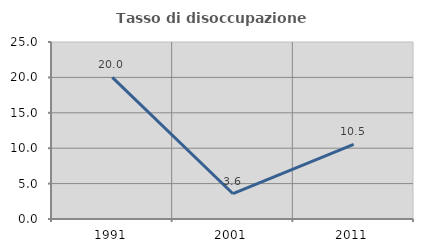
| Category | Tasso di disoccupazione giovanile  |
|---|---|
| 1991.0 | 20 |
| 2001.0 | 3.571 |
| 2011.0 | 10.526 |